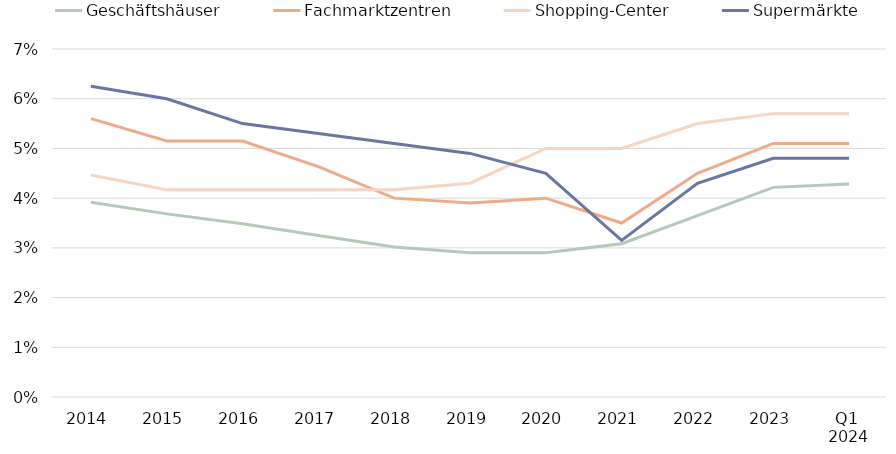
| Category | Geschäftshäuser | Fachmarktzentren | Shopping-Center | Supermärkte |
|---|---|---|---|---|
| 2014 | 0.039 | 0.056 | 0.045 | 0.062 |
| 2015 | 0.037 | 0.052 | 0.042 | 0.06 |
| 2016 | 0.035 | 0.052 | 0.042 | 0.055 |
| 2017 | 0.032 | 0.046 | 0.042 | 0.053 |
| 2018 | 0.03 | 0.04 | 0.042 | 0.051 |
| 2019 | 0.029 | 0.039 | 0.043 | 0.049 |
| 2020 | 0.029 | 0.04 | 0.05 | 0.045 |
| 2021 | 0.031 | 0.035 | 0.05 | 0.032 |
| 2022 | 0.037 | 0.045 | 0.055 | 0.043 |
| 2023 | 0.042 | 0.051 | 0.057 | 0.048 |
| Q1 
2024 | 0.043 | 0.051 | 0.057 | 0.048 |